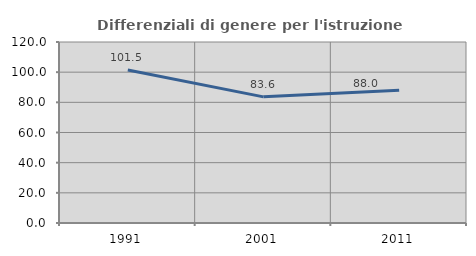
| Category | Differenziali di genere per l'istruzione superiore |
|---|---|
| 1991.0 | 101.456 |
| 2001.0 | 83.622 |
| 2011.0 | 88.045 |